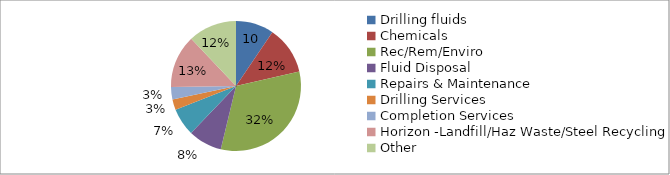
| Category | Series 0 |
|---|---|
| Drilling fluids | 1492607 |
| Chemicals | 1886535 |
| Rec/Rem/Enviro | 5110893 |
| Fluid Disposal | 1326806 |
| Repairs & Maintenance | 1082412 |
| Drilling Services | 417625 |
| Completion Services | 488132 |
| Horizon -Landfill/Haz Waste/Steel Recycling | 2076683 |
| Other | 1909159 |